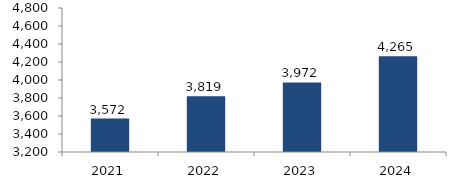
| Category | Bogotá |
|---|---|
| 2021.0 | 3572.184 |
| 2022.0 | 3819.123 |
| 2023.0 | 3972.327 |
| 2024.0 | 4264.775 |